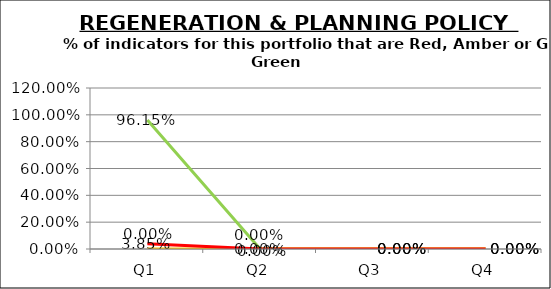
| Category | Green | Amber | Red |
|---|---|---|---|
| Q1 | 0.962 | 0 | 0.038 |
| Q2 | 0 | 0 | 0 |
| Q3 | 0 | 0 | 0 |
| Q4 | 0 | 0 | 0 |